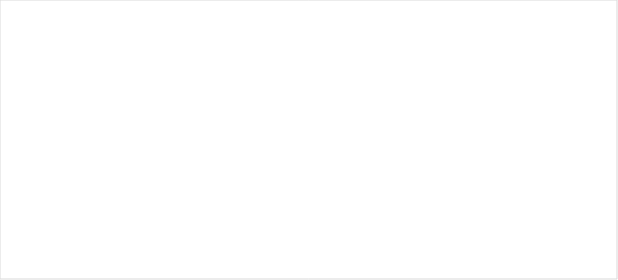
| Category | Series 0 |
|---|---|
| Agua potable de la red de distribución | 0 |
| Agua extraída de pozos | 0 |
| Agua extraída de fuentes superficiales | 0 |